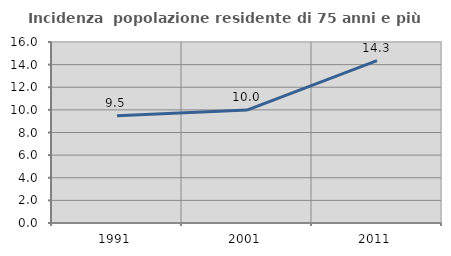
| Category | Incidenza  popolazione residente di 75 anni e più |
|---|---|
| 1991.0 | 9.477 |
| 2001.0 | 9.986 |
| 2011.0 | 14.348 |